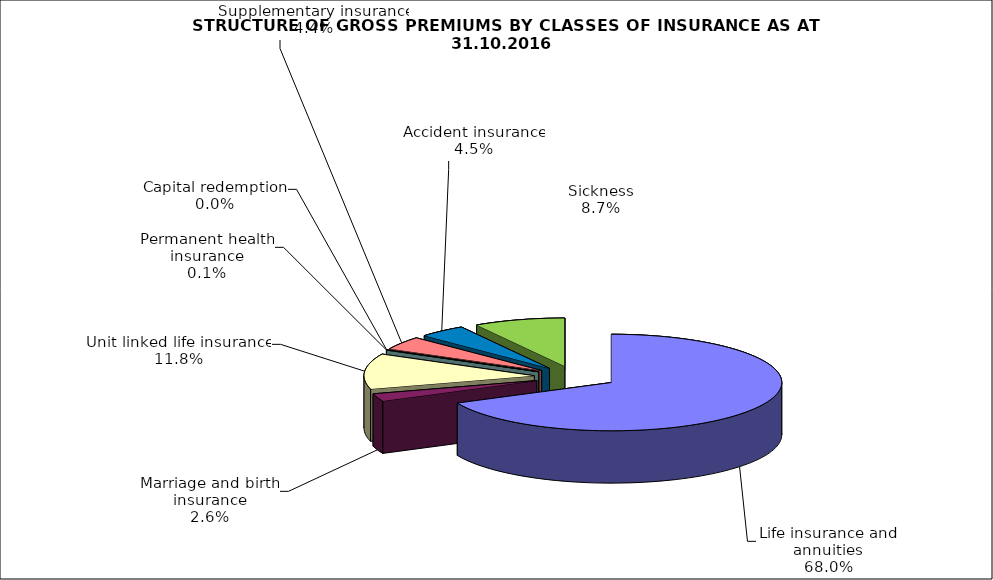
| Category | Series 0 |
|---|---|
| Life insurance and annuities | 238711557.031 |
| Marriage and birth insurance | 8985094.149 |
| Unit linked life insurance | 41550278.837 |
| Permanent health insurance | 259959.88 |
| Capital redemption | 0 |
| Supplementary insurance | 15358197.213 |
| Accident insurance | 15784598.74 |
| Sickness | 30387323.47 |